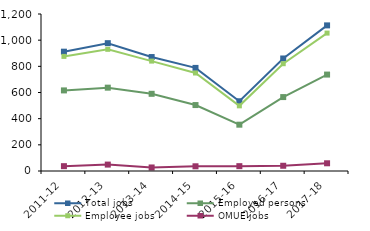
| Category | Total jobs | Employed persons | Employee jobs | OMUE jobs |
|---|---|---|---|---|
| 2011-12 | 912 | 616 | 876 | 37 |
| 2012-13 | 977 | 637 | 930 | 49 |
| 2013-14 | 871 | 590 | 840 | 27 |
| 2014-15 | 788 | 504 | 749 | 36 |
| 2015-16 | 533 | 354 | 498 | 37 |
| 2016-17 | 860 | 565 | 820 | 40 |
| 2017-18 | 1113 | 737 | 1054 | 59 |